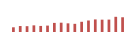
| Category | Importações (2) |
|---|---|
| 0 | 62681.056 |
| 1 | 79621.593 |
| 2 | 77709.867 |
| 3 | 88593.929 |
| 4 | 80744.22 |
| 5 | 85348.563 |
| 6 | 121368.935 |
| 7 | 124143.971 |
| 8 | 115571.707 |
| 9 | 109068.986 |
| 10 | 136178.726 |
| 11 | 153404.387 |
| 12 | 167744.463 |
| 13 | 164346.623 |
| 14 | 165333.113 |
| 15 | 202578.515 |
| 16 | 196398.758 |